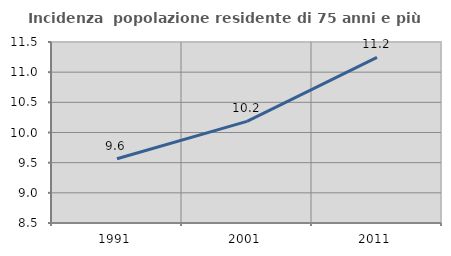
| Category | Incidenza  popolazione residente di 75 anni e più |
|---|---|
| 1991.0 | 9.565 |
| 2001.0 | 10.185 |
| 2011.0 | 11.245 |